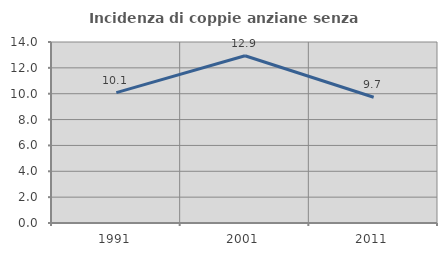
| Category | Incidenza di coppie anziane senza figli  |
|---|---|
| 1991.0 | 10.083 |
| 2001.0 | 12.938 |
| 2011.0 | 9.726 |